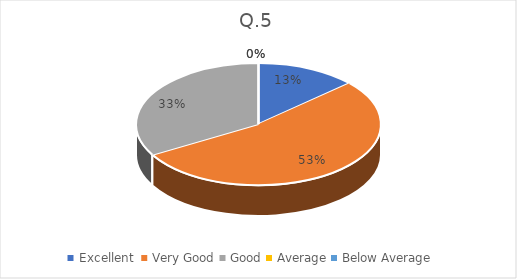
| Category | Series 0 |
|---|---|
| Excellent  | 2 |
| Very Good | 8 |
| Good | 5 |
| Average | 0 |
| Below Average | 0 |